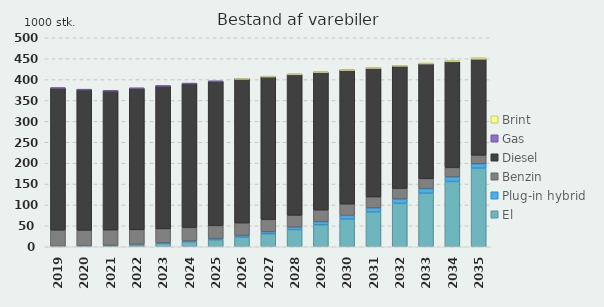
| Category | El | Plug-in hybrid | Benzin | Diesel | Gas | Brint |
|---|---|---|---|---|---|---|
| 2019 | 0.89 | 0.26 | 38.66 | 339.9 | 0.14 | 0 |
| 2020 | 1.32 | 0.43 | 37.71 | 336.51 | 0.15 | 0 |
| 2021 | 2.63 | 0.78 | 36.76 | 332.86 | 0.14 | 0 |
| 2022 | 4.74 | 1.17 | 34.96 | 338.32 | 0.14 | 0 |
| 2023 | 7.76 | 1.66 | 33.42 | 341.87 | 0.13 | 0 |
| 2024 | 11.7 | 2.26 | 32.14 | 344.38 | 0.13 | 0 |
| 2025 | 16.54 | 2.95 | 31.06 | 345.42 | 0.12 | 0 |
| 2026 | 22.98 | 3.79 | 30.13 | 344.55 | 0.11 | 0.06 |
| 2027 | 31.11 | 4.77 | 29.35 | 341.56 | 0.1 | 0.18 |
| 2028 | 40.99 | 5.9 | 28.63 | 336.61 | 0.09 | 0.36 |
| 2029 | 52.69 | 7.19 | 27.95 | 329.49 | 0.08 | 0.61 |
| 2030 | 66.18 | 8.64 | 27.24 | 320.31 | 0.07 | 0.93 |
| 2031 | 83.16 | 9.75 | 26.36 | 308.01 | 0.06 | 1.31 |
| 2032 | 103.76 | 10.5 | 25.25 | 292.79 | 0.05 | 1.77 |
| 2033 | 128.08 | 10.88 | 23.93 | 274.64 | 0.04 | 2.3 |
| 2034 | 156.17 | 10.86 | 22.36 | 253.7 | 0.03 | 2.9 |
| 2035 | 188.08 | 10.42 | 20.55 | 230.05 | 0.03 | 3.58 |